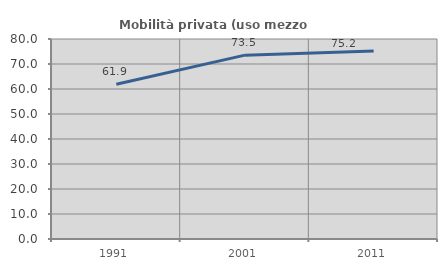
| Category | Mobilità privata (uso mezzo privato) |
|---|---|
| 1991.0 | 61.92 |
| 2001.0 | 73.543 |
| 2011.0 | 75.223 |